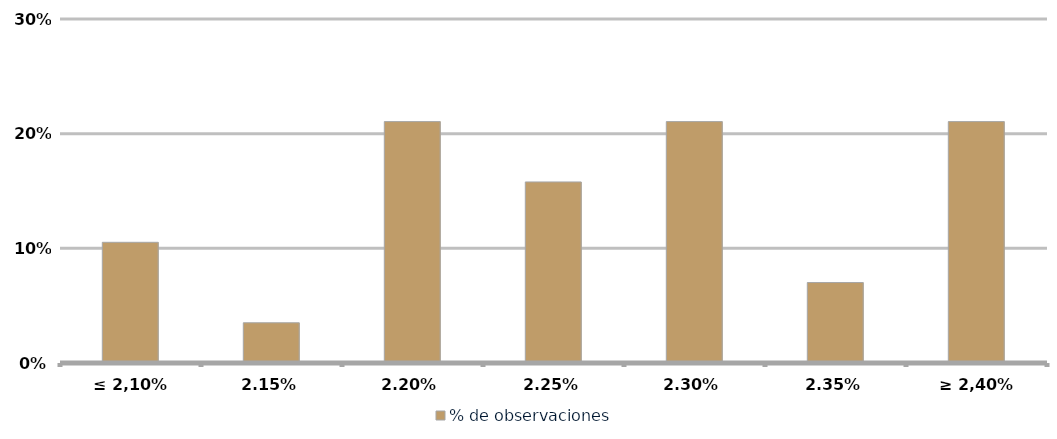
| Category | % de observaciones  |
|---|---|
| ≤ 2,10% | 0.105 |
| 2,15% | 0.035 |
| 2,20% | 0.211 |
| 2,25% | 0.158 |
| 2,30% | 0.211 |
| 2,35% | 0.07 |
| ≥ 2,40% | 0.211 |